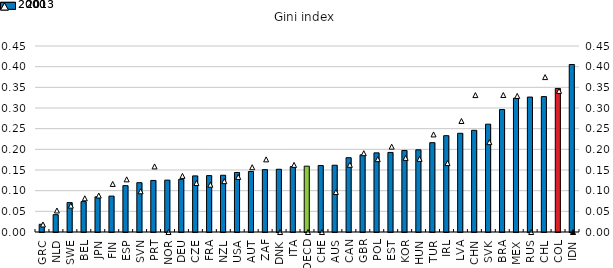
| Category | 2013 |
|---|---|
| GRC | 0.019 |
| NLD | 0.042 |
| SWE | 0.071 |
| BEL | 0.073 |
| JPN | 0.085 |
| FIN | 0.087 |
| ESP | 0.112 |
| SVN | 0.119 |
| PRT | 0.125 |
| NOR | 0.126 |
| DEU | 0.127 |
| CZE | 0.136 |
| FRA | 0.136 |
| NZL | 0.137 |
| USA | 0.144 |
| AUT | 0.146 |
| ZAF | 0.151 |
| DNK | 0.152 |
| ITA | 0.158 |
| OECD | 0.159 |
| CHE | 0.161 |
| AUS | 0.162 |
| CAN | 0.18 |
| GBR | 0.187 |
| POL | 0.191 |
| EST | 0.192 |
| KOR | 0.197 |
| HUN | 0.199 |
| TUR | 0.216 |
| IRL | 0.233 |
| LVA | 0.239 |
| CHN | 0.246 |
| SVK | 0.261 |
| BRA | 0.296 |
| MEX | 0.324 |
| RUS | 0.326 |
| CHL | 0.328 |
| COL | 0.347 |
| IDN | 0.405 |